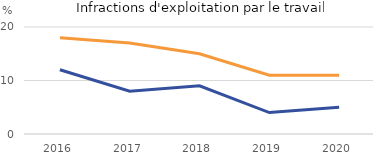
| Category | Part des victimes mineures française | Part des victimes mineures |
|---|---|---|
| 2016.0 | 12 | 18 |
| 2017.0 | 8 | 17 |
| 2018.0 | 9 | 15 |
| 2019.0 | 4 | 11 |
| 2020.0 | 5 | 11 |